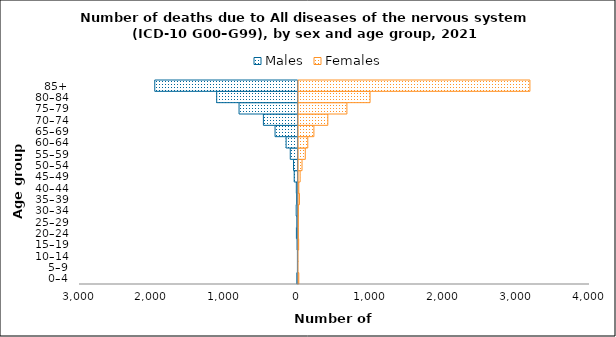
| Category | Males | Females |
|---|---|---|
| 0–4 | -17 | 17 |
| 5–9 | -9 | 4 |
| 10–14 | -9 | 4 |
| 15–19 | -14 | 15 |
| 20–24 | -23 | 9 |
| 25–29 | -17 | 9 |
| 30–34 | -26 | 10 |
| 35–39 | -19 | 26 |
| 40–44 | -24 | 17 |
| 45–49 | -53 | 35 |
| 50–54 | -62 | 61 |
| 55–59 | -107 | 106 |
| 60–64 | -164 | 140 |
| 65–69 | -316 | 224 |
| 70–74 | -476 | 415 |
| 75–79 | -810 | 677 |
| 80–84 | -1117 | 995 |
| 85+ | -1967 | 3189 |